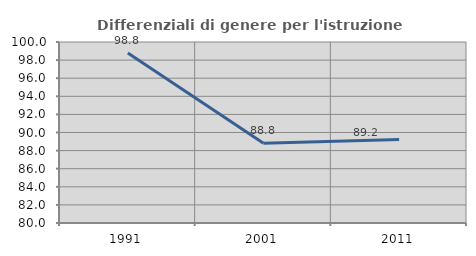
| Category | Differenziali di genere per l'istruzione superiore |
|---|---|
| 1991.0 | 98.79 |
| 2001.0 | 88.8 |
| 2011.0 | 89.234 |